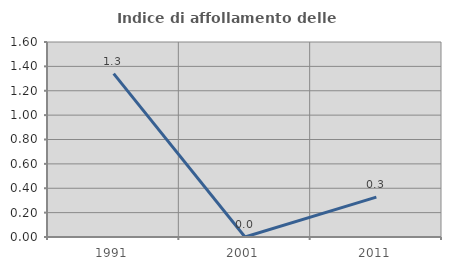
| Category | Indice di affollamento delle abitazioni  |
|---|---|
| 1991.0 | 1.34 |
| 2001.0 | 0 |
| 2011.0 | 0.327 |